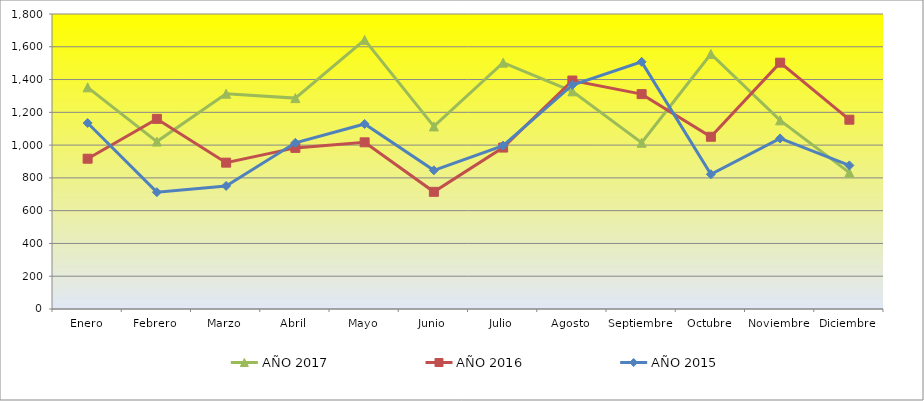
| Category | AÑO 2017 | AÑO 2016 | AÑO 2015 |
|---|---|---|---|
| Enero | 1352.432 | 917 | 1135 |
| Febrero | 1021.622 | 1160 | 713 |
| Marzo | 1313.514 | 893 | 751 |
| Abril | 1286.757 | 983 | 1014 |
| Mayo | 1641.892 | 1017 | 1129 |
| Junio | 1114.054 | 715 | 846 |
| Julio | 1503.243 | 985 | 997 |
| Agosto | 1328.108 | 1394 | 1367 |
| Septiembre | 1014.324 | 1311 | 1508 |
| Octubre | 1556.053 | 1051 | 822 |
| Noviembre | 1151.053 | 1503 | 1041 |
| Diciembre | 831.892 | 1155 | 876 |